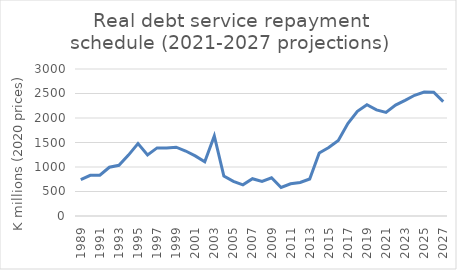
| Category | Projected debt service repayment schedule |
|---|---|
| 1989.0 | 744.339 |
| 1990.0 | 831.465 |
| 1991.0 | 833.862 |
| 1992.0 | 994.971 |
| 1993.0 | 1035.418 |
| 1994.0 | 1243.118 |
| 1995.0 | 1479.918 |
| 1996.0 | 1248.042 |
| 1997.0 | 1389.84 |
| 1998.0 | 1386.371 |
| 1999.0 | 1404.791 |
| 2000.0 | 1326.356 |
| 2001.0 | 1226.082 |
| 2002.0 | 1105.325 |
| 2003.0 | 1632.942 |
| 2004.0 | 815.096 |
| 2005.0 | 706.65 |
| 2006.0 | 636.776 |
| 2007.0 | 760.728 |
| 2008.0 | 706.984 |
| 2009.0 | 779.434 |
| 2010.0 | 582.944 |
| 2011.0 | 658.058 |
| 2012.0 | 683.934 |
| 2013.0 | 755.199 |
| 2014.0 | 1285.172 |
| 2015.0 | 1396.415 |
| 2016.0 | 1539.618 |
| 2017.0 | 1887.764 |
| 2018.0 | 2134.957 |
| 2019.0 | 2269.59 |
| 2020.0 | 2165.1 |
| 2021.0 | 2113.121 |
| 2022.0 | 2262.899 |
| 2023.0 | 2360.441 |
| 2024.0 | 2463.476 |
| 2025.0 | 2530.326 |
| 2026.0 | 2525.089 |
| 2027.0 | 2334.395 |